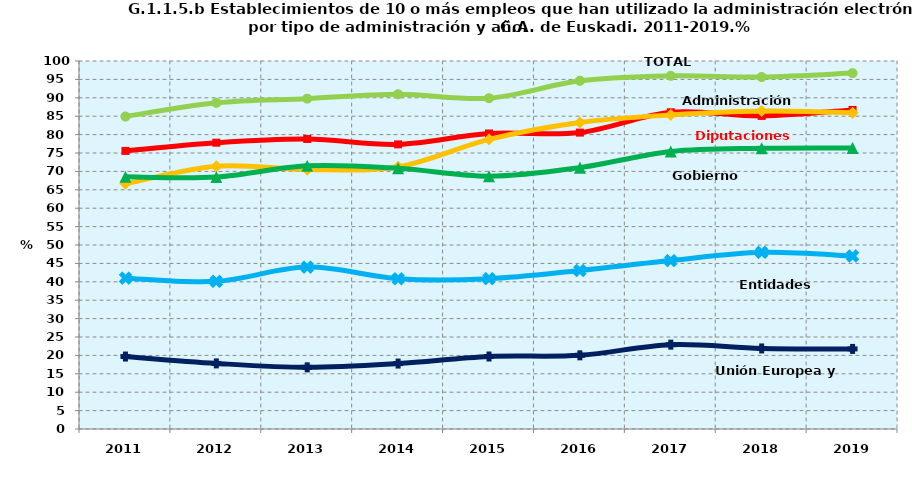
| Category | TOTAL | Diputaciones Forales | Administración Central | Gobierno Vasco | Entidades Locales | Unión Europea y Otros |
|---|---|---|---|---|---|---|
| 2011.0 | 84.919 | 75.566 | 66.635 | 68.518 | 40.99 | 19.69 |
| 2012.0 | 88.639 | 77.803 | 71.399 | 68.457 | 40.12 | 17.825 |
| 2013.0 | 89.774 | 78.814 | 70.5 | 71.513 | 43.99 | 16.752 |
| 2014.0 | 90.972 | 77.343 | 71.245 | 70.852 | 40.845 | 17.779 |
| 2015.0 | 89.9 | 80.3 | 78.7 | 68.7 | 40.845 | 19.7 |
| 2016.0 | 94.63 | 80.543 | 83.285 | 71.025 | 43.062 | 20.023 |
| 2017.0 | 95.964 | 86.074 | 85.341 | 75.396 | 45.758 | 22.918 |
| 2018.0 | 95.655 | 85.076 | 86.41 | 76.28 | 48.003 | 21.89 |
| 2019.0 | 96.71 | 86.706 | 85.942 | 76.372 | 47.022 | 21.763 |